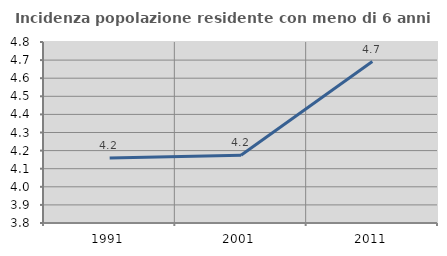
| Category | Incidenza popolazione residente con meno di 6 anni |
|---|---|
| 1991.0 | 4.159 |
| 2001.0 | 4.174 |
| 2011.0 | 4.692 |